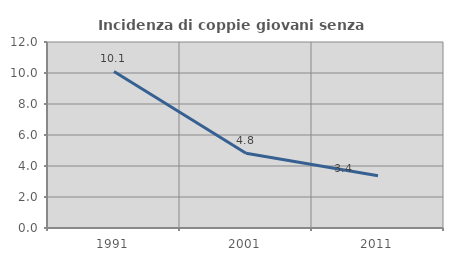
| Category | Incidenza di coppie giovani senza figli |
|---|---|
| 1991.0 | 10.099 |
| 2001.0 | 4.819 |
| 2011.0 | 3.373 |